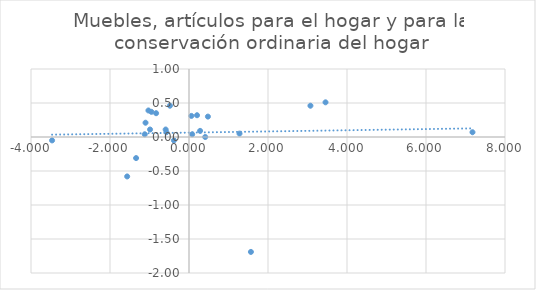
| Category | Muebles, artículos para el hogar y para la conservación ordinaria del hogar |
|---|---|
| 0.06052582200249956 | 0.31 |
| -1.339539147515001 | -0.31 |
| -1.1203229332582998 | 0.04 |
| -0.9862037445886013 | 0.11 |
| -3.4662710747771994 | -0.05 |
| 0.4103518494638997 | 0 |
| -1.5653149541481977 | -0.58 |
| 1.5673496706761991 | -1.69 |
| 7.1770364527009995 | 0.07 |
| 0.47884246635880034 | 0.3 |
| -0.832734952533401 | 0.35 |
| 3.4562493478376117 | 0.51 |
| 0.28079979651694786 | 0.09 |
| -0.5906758229193689 | 0.11 |
| -0.38208630553888956 | -0.05 |
| -0.5726169698249004 | 0.07 |
| 0.08025158798270066 | 0.04 |
| 1.2789830493301095 | 0.05 |
| -1.1005497828799102 | 0.21 |
| 0.20330044603610042 | 0.32 |
| -0.48222478231940147 | 0.46 |
| -0.9518304220709997 | 0.37 |
| -1.027059621055 | 0.39 |
| 3.074367518631871 | 0.46 |